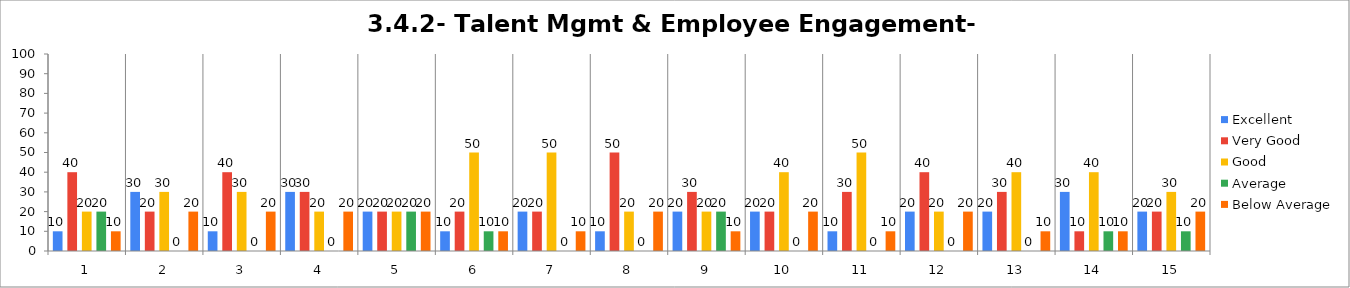
| Category | Excellent | Very Good | Good | Average | Below Average |
|---|---|---|---|---|---|
| 0 | 10 | 40 | 20 | 20 | 10 |
| 1 | 30 | 20 | 30 | 0 | 20 |
| 2 | 10 | 40 | 30 | 0 | 20 |
| 3 | 30 | 30 | 20 | 0 | 20 |
| 4 | 20 | 20 | 20 | 20 | 20 |
| 5 | 10 | 20 | 50 | 10 | 10 |
| 6 | 20 | 20 | 50 | 0 | 10 |
| 7 | 10 | 50 | 20 | 0 | 20 |
| 8 | 20 | 30 | 20 | 20 | 10 |
| 9 | 20 | 20 | 40 | 0 | 20 |
| 10 | 10 | 30 | 50 | 0 | 10 |
| 11 | 20 | 40 | 20 | 0 | 20 |
| 12 | 20 | 30 | 40 | 0 | 10 |
| 13 | 30 | 10 | 40 | 10 | 10 |
| 14 | 20 | 20 | 30 | 10 | 20 |